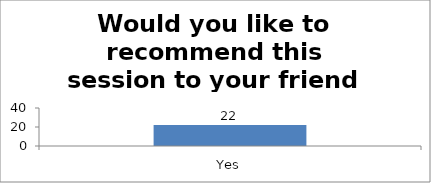
| Category | Would you like to recommend this session to your friend or colleague? |
|---|---|
| Yes | 22 |